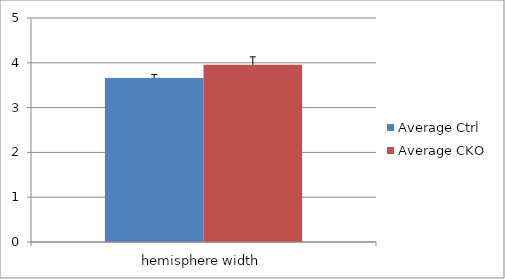
| Category | Average Ctrl | Average CKO |
|---|---|---|
| 0 | 3.661 | 3.955 |